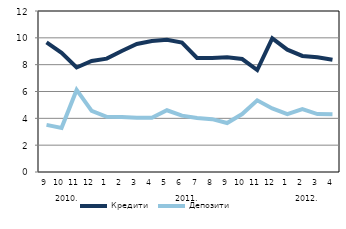
| Category | Кредити | Депозити |
|---|---|---|
| 0 | 9.66 | 3.51 |
| 1900-01-01 | 8.88 | 3.29 |
| 1900-01-02 | 7.79 | 6.12 |
| 1900-01-03 | 8.28 | 4.56 |
| 1900-01-04 | 8.45 | 4.11 |
| 1900-01-05 | 9.02 | 4.1 |
| 1900-01-06 | 9.54 | 4.04 |
| 1900-01-07 | 9.77 | 4.04 |
| 1900-01-08 | 9.85 | 4.6 |
| 1900-01-09 | 9.65 | 4.2 |
| 1900-01-10 | 8.5 | 4.02 |
| 1900-01-11 | 8.49 | 3.94 |
| 1900-01-12 | 8.55 | 3.65 |
| 1900-01-13 | 8.42 | 4.32 |
| 1900-01-14 | 7.6 | 5.34 |
| 1900-01-15 | 9.96 | 4.74 |
| 1900-01-16 | 9.12 | 4.32 |
| 1900-01-17 | 8.65 | 4.69 |
| 1900-01-18 | 8.55 | 4.32 |
| 1900-01-19 | 8.36 | 4.3 |